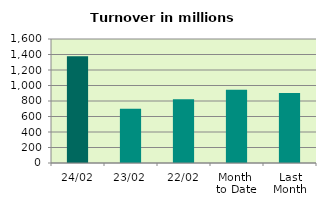
| Category | Series 0 |
|---|---|
| 24/02 | 1378.474 |
| 23/02 | 700.797 |
| 22/02 | 823.093 |
| Month 
to Date | 946.088 |
| Last
Month | 902.557 |